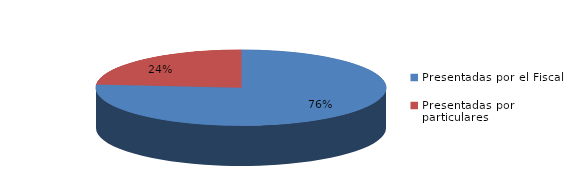
| Category | Series 0 |
|---|---|
| Presentadas por el Fiscal | 129 |
| Presentadas por particulares | 40 |